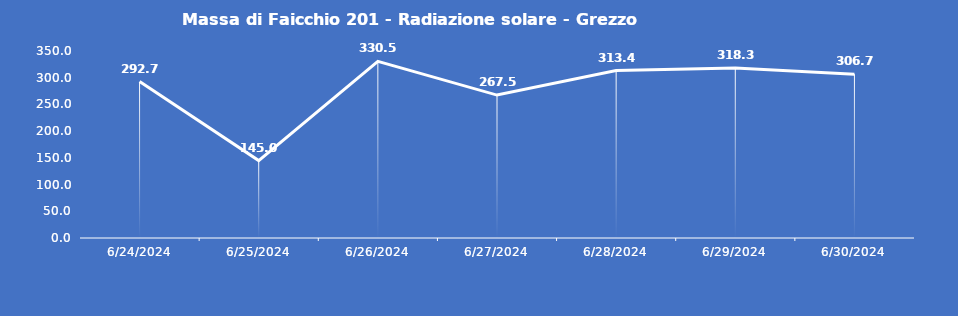
| Category | Massa di Faicchio 201 - Radiazione solare - Grezzo (W/m2) |
|---|---|
| 6/24/24 | 292.7 |
| 6/25/24 | 145 |
| 6/26/24 | 330.5 |
| 6/27/24 | 267.5 |
| 6/28/24 | 313.4 |
| 6/29/24 | 318.3 |
| 6/30/24 | 306.7 |